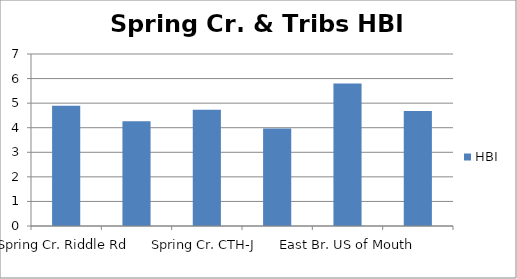
| Category | HBI |
|---|---|
| Spring Cr. Riddle Rd | 4.89 |
| Spring Cr. US STP | 4.26 |
| Spring Cr. CTH-J | 4.73 |
| South Br. US Of Mouth | 3.97 |
| East Br. US of Mouth | 5.8 |
| Unnamed Trib US CTH-J | 4.68 |